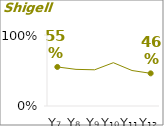
| Category | Shigella 2b |
|---|---|
| Y₇ | 0.55 |
| Y₈ | 0.516 |
| Y₉ | 0.51 |
| Y₁₀ | 0.61 |
| Y₁₁ | 0.5 |
| Y₁₂ | 0.46 |